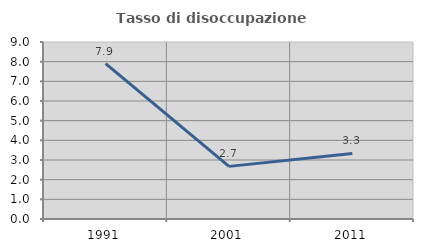
| Category | Tasso di disoccupazione giovanile  |
|---|---|
| 1991.0 | 7.904 |
| 2001.0 | 2.676 |
| 2011.0 | 3.333 |